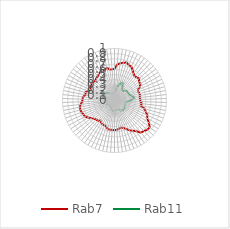
| Category | Rab7 | Rab11 |
|---|---|---|
| 0.0 | 0.612 | 0.156 |
| 0.10913 | 0.691 | 0.173 |
| 0.21825 | 0.725 | 0.235 |
| 0.32738 | 0.745 | 0.291 |
| 0.43651 | 0.766 | 0.335 |
| 0.54563 | 0.734 | 0.363 |
| 0.65476 | 0.73 | 0.354 |
| 0.76389 | 0.68 | 0.301 |
| 0.87302 | 0.638 | 0.244 |
| 0.98214 | 0.608 | 0.235 |
| 1.09127 | 0.619 | 0.253 |
| 1.2004 | 0.636 | 0.281 |
| 1.30952 | 0.59 | 0.299 |
| 1.41865 | 0.592 | 0.294 |
| 1.52778 | 0.555 | 0.303 |
| 1.6369 | 0.495 | 0.299 |
| 1.74603 | 0.486 | 0.322 |
| 1.85516 | 0.501 | 0.346 |
| 1.96429 | 0.498 | 0.368 |
| 2.07341 | 0.488 | 0.374 |
| 2.18254 | 0.494 | 0.334 |
| 2.29167 | 0.496 | 0.278 |
| 2.40079 | 0.53 | 0.23 |
| 2.50992 | 0.514 | 0.206 |
| 2.61905 | 0.596 | 0.219 |
| 2.72817 | 0.638 | 0.23 |
| 2.8373 | 0.692 | 0.23 |
| 2.94643 | 0.72 | 0.229 |
| 3.05556 | 0.787 | 0.237 |
| 3.16468 | 0.852 | 0.239 |
| 3.27381 | 0.845 | 0.25 |
| 3.38294 | 0.816 | 0.251 |
| 3.49206 | 0.799 | 0.242 |
| 3.60119 | 0.723 | 0.24 |
| 3.71032 | 0.675 | 0.227 |
| 3.81944 | 0.639 | 0.19 |
| 3.92857 | 0.586 | 0.184 |
| 4.0377 | 0.551 | 0.186 |
| 4.14683 | 0.54 | 0.181 |
| 4.25595 | 0.551 | 0.184 |
| 4.36508 | 0.564 | 0.184 |
| 4.47421 | 0.57 | 0.199 |
| 4.58333 | 0.566 | 0.213 |
| 4.69246 | 0.568 | 0.201 |
| 4.80159 | 0.563 | 0.194 |
| 4.91071 | 0.532 | 0.181 |
| 5.01984 | 0.515 | 0.159 |
| 5.12897 | 0.514 | 0.139 |
| 5.2381 | 0.503 | 0.141 |
| 5.34722 | 0.47 | 0.128 |
| 5.45635 | 0.505 | 0.131 |
| 5.56548 | 0.507 | 0.126 |
| 5.6746 | 0.532 | 0.13 |
| 5.78373 | 0.557 | 0.135 |
| 5.89286 | 0.603 | 0.141 |
| 6.00198 | 0.645 | 0.146 |
| 6.11111 | 0.655 | 0.162 |
| 6.22024 | 0.67 | 0.16 |
| 6.32937 | 0.681 | 0.157 |
| 6.43849 | 0.677 | 0.155 |
| 6.54762 | 0.656 | 0.15 |
| 6.65675 | 0.621 | 0.148 |
| 6.76587 | 0.616 | 0.144 |
| 6.875 | 0.608 | 0.153 |
| 6.98413 | 0.567 | 0.17 |
| 7.09325 | 0.579 | 0.19 |
| 7.20238 | 0.55 | 0.18 |
| 7.31151 | 0.497 | 0.187 |
| 7.42063 | 0.538 | 0.219 |
| 7.52976 | 0.523 | 0.244 |
| 7.63889 | 0.558 | 0.242 |
| 7.74802 | 0.537 | 0.228 |
| 7.85714 | 0.531 | 0.202 |
| 7.96627 | 0.556 | 0.185 |
| 8.0754 | 0.563 | 0.165 |
| 8.18452 | 0.589 | 0.146 |
| 8.29365 | 0.618 | 0.149 |
| 8.40278 | 0.607 | 0.138 |
| 8.5119 | 0.625 | 0.136 |
| 8.62103 | 0.644 | 0.135 |
| 8.73016 | 0.604 | 0.152 |
| 8.83929 | 0.599 | 0.15 |